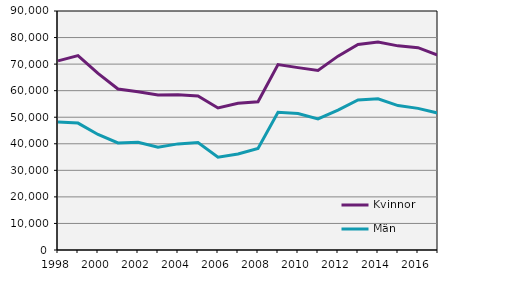
| Category | Kvinnor | Män |
|---|---|---|
| 1998 | 71201 | 48192 |
| 1999 | 73194 | 47789 |
| 2000 | 66491 | 43495 |
| 2001 | 60639 | 40301 |
| 2002 | 59598 | 40532 |
| 2003 | 58330 | 38727 |
| 2004 | 58434 | 39957 |
| 2005 | 58019 | 40481 |
| 2006 | 53471 | 34944 |
| 2007 | 55277 | 36155 |
| 2008 | 55847 | 38199 |
| 2009 | 69814 | 51848 |
| 2010 | 68674 | 51375 |
| 2011 | 67596 | 49376 |
| 2012 | 72998 | 52689 |
| 2013 | 77428 | 56510 |
| 2014 | 78294 | 56964 |
| 2015 | 76874 | 54394 |
| 2016 | 76183 | 53326 |
| 2017 | 73362 | 51564 |